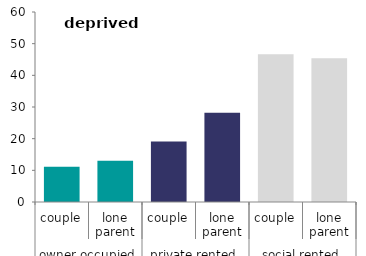
| Category | deprived areas |
|---|---|
| 0 | 11.163 |
| 1 | 13.039 |
| 2 | 19.077 |
| 3 | 28.178 |
| 4 | 46.662 |
| 5 | 45.381 |